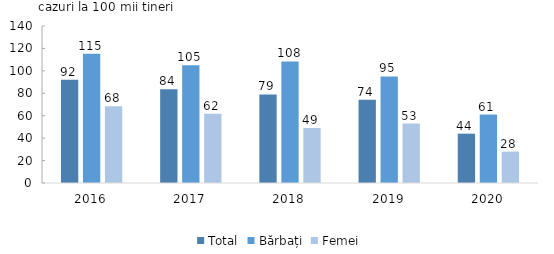
| Category | Total | Bărbați | Femei |
|---|---|---|---|
| 2016.0 | 92.071 | 115.18 | 68.392 |
| 2017.0 | 83.54 | 105.072 | 61.664 |
| 2018.0 | 78.949 | 108.443 | 49.115 |
| 2019.0 | 74.336 | 95 | 53 |
| 2020.0 | 44 | 61 | 28 |